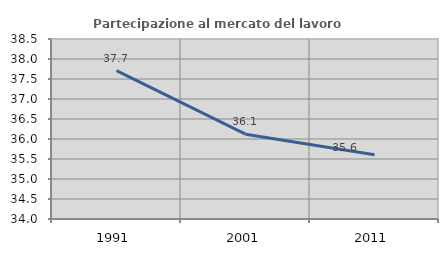
| Category | Partecipazione al mercato del lavoro  femminile |
|---|---|
| 1991.0 | 37.709 |
| 2001.0 | 36.12 |
| 2011.0 | 35.606 |